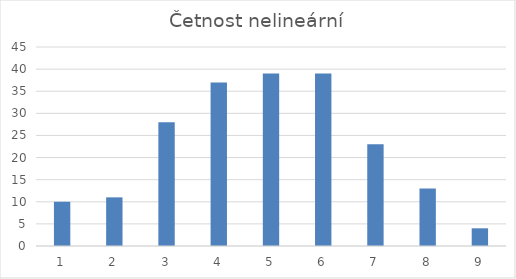
| Category | Četnost nelineární |
|---|---|
| 1.0 | 10 |
| 2.0 | 11 |
| 3.0 | 28 |
| 4.0 | 37 |
| 5.0 | 39 |
| 6.0 | 39 |
| 7.0 | 23 |
| 8.0 | 13 |
| 9.0 | 4 |